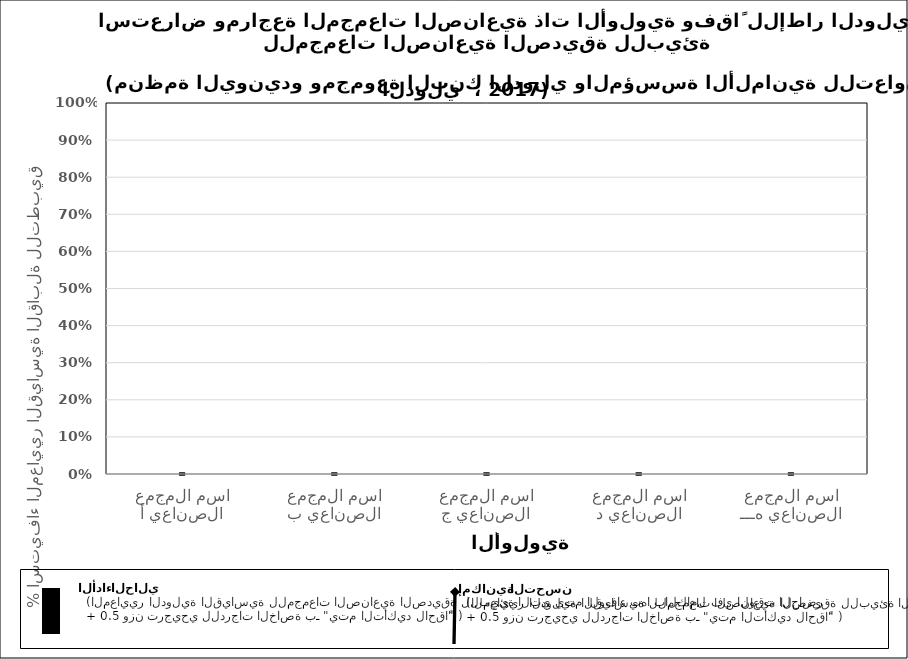
| Category | الأداء الحالي |
|---|---|
| اسم المجمع الصناعي أ | 0 |
| اسم المجمع الصناعي ب | 0 |
| اسم المجمع الصناعي ج | 0 |
| اسم المجمع الصناعي د | 0 |
| اسم المجمع الصناعي هـــ | 0 |